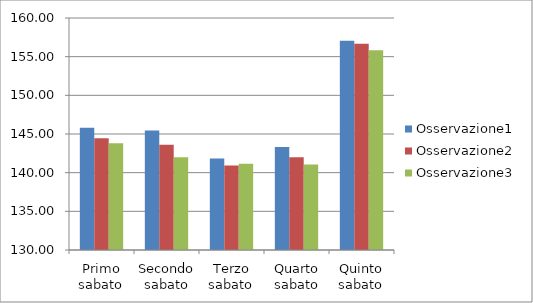
| Category | Osservazione1 | Osservazione2 | Osservazione3 |
|---|---|---|---|
| Primo sabato | 145.822 | 144.444 | 143.802 |
| Secondo sabato | 145.455 | 143.614 | 141.984 |
| Terzo sabato | 141.826 | 140.921 | 141.144 |
| Quarto sabato | 143.316 | 141.979 | 141.043 |
| Quinto sabato | 157.046 | 156.676 | 155.827 |